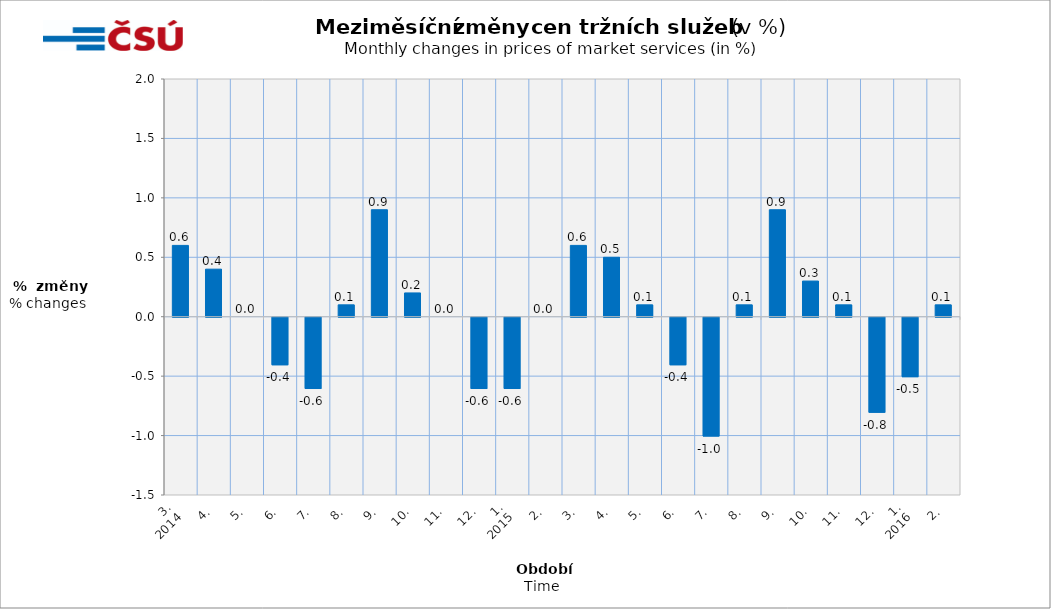
| Category | Meziměsíční změny v % |
|---|---|
| 0 | 0.6 |
| 1 | 0.4 |
| 2 | 0 |
| 3 | -0.4 |
| 4 | -0.6 |
| 5 | 0.1 |
| 6 | 0.9 |
| 7 | 0.2 |
| 8 | 0 |
| 9 | -0.6 |
| 10 | -0.6 |
| 11 | 0 |
| 12 | 0.6 |
| 13 | 0.5 |
| 14 | 0.1 |
| 15 | -0.4 |
| 16 | -1 |
| 17 | 0.1 |
| 18 | 0.9 |
| 19 | 0.3 |
| 20 | 0.1 |
| 21 | -0.8 |
| 22 | -0.5 |
| 23 | 0.1 |